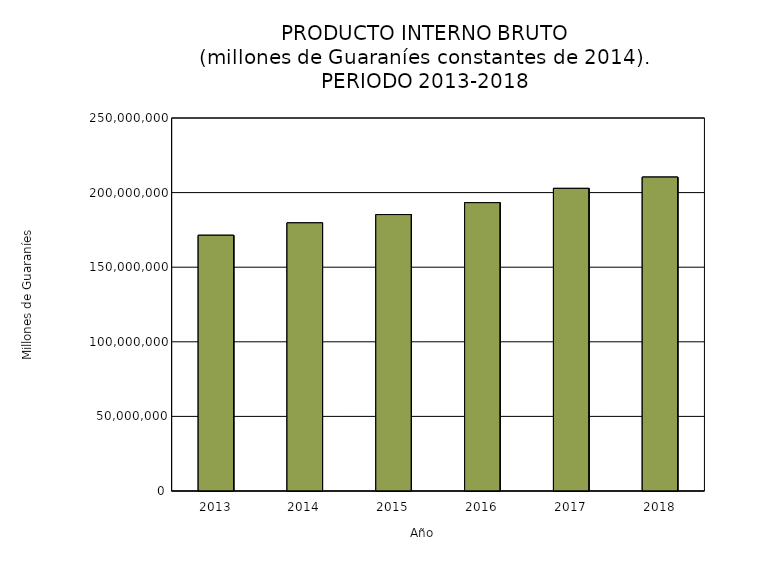
| Category | Series 0 |
|---|---|
| 2013.0 | 171390504.671 |
| 2014.0 | 179721609.209 |
| 2015.0 | 185257706.945 |
| 2016.0 | 193247695.796 |
| 2017.0 | 202829015.924 |
| 2018.0 | 210378210.026 |